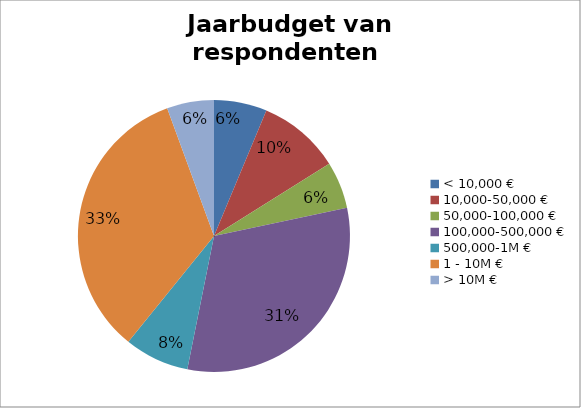
| Category | Aantal |
|---|---|
| < 10,000 € | 9 |
| 10,000-50,000 € | 14 |
| 50,000-100,000 € | 8 |
| 100,000-500,000 € | 45 |
| 500,000-1M € | 11 |
| 1 - 10M € | 48 |
| > 10M € | 8 |